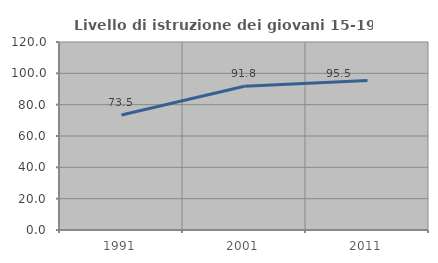
| Category | Livello di istruzione dei giovani 15-19 anni |
|---|---|
| 1991.0 | 73.458 |
| 2001.0 | 91.787 |
| 2011.0 | 95.49 |